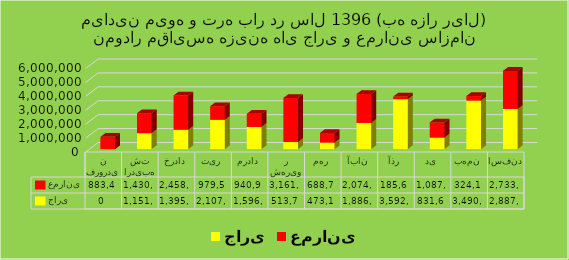
| Category | جاری | عمرانی |
|---|---|---|
| فروردین | 0 | 883456 |
| اردیبهشت | 1151052 | 1430587 |
| خرداد | 1395020 | 2458149 |
| تیر | 2107618 | 979531 |
| مرداد | 1596857 | 940967 |
| شهریور | 513709 | 3161227 |
| مهر | 473115 | 688729 |
| آبان | 1886637 | 2074689 |
| آذر | 3592026 | 185608 |
| دی | 831690 | 1087943 |
| بهمن | 3490979 | 324142 |
| اسفند | 2887917 | 2733961 |